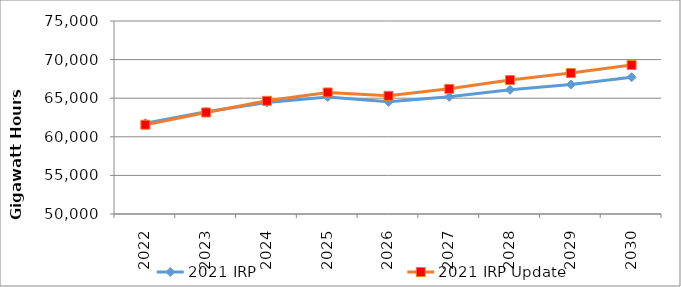
| Category | 2021 IRP | 2021 IRP Update |
|---|---|---|
| 2022.0 | 61760.91 | 61564.33 |
| 2023.0 | 63242.99 | 63153.01 |
| 2024.0 | 64451.31 | 64661.77 |
| 2025.0 | 65162.26 | 65743.1 |
| 2026.0 | 64527.03 | 65308.27 |
| 2027.0 | 65178.4 | 66210.48 |
| 2028.0 | 66083.42 | 67345.98 |
| 2029.0 | 66768.66 | 68250.27 |
| 2030.0 | 67723.21 | 69298.26 |